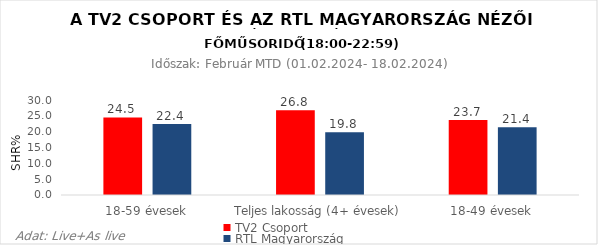
| Category | TV2 Csoport | RTL Magyarország |
|---|---|---|
| 18-59 évesek | 24.5 | 22.4 |
| Teljes lakosság (4+ évesek) | 26.8 | 19.8 |
| 18-49 évesek | 23.7 | 21.4 |